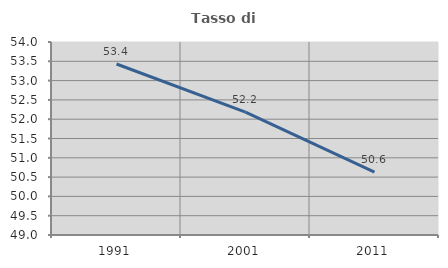
| Category | Tasso di occupazione   |
|---|---|
| 1991.0 | 53.43 |
| 2001.0 | 52.183 |
| 2011.0 | 50.627 |